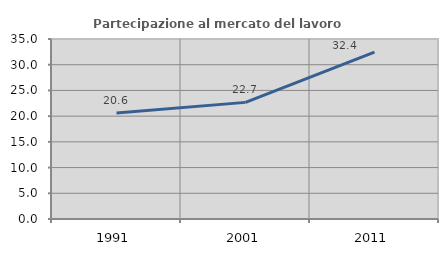
| Category | Partecipazione al mercato del lavoro  femminile |
|---|---|
| 1991.0 | 20.605 |
| 2001.0 | 22.677 |
| 2011.0 | 32.443 |